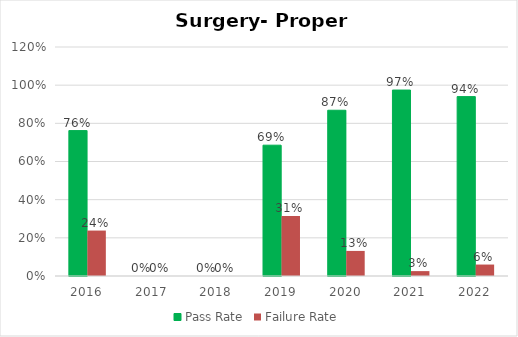
| Category | Pass Rate | Failure Rate |
|---|---|---|
| 2016.0 | 0.762 | 0.238 |
| 2017.0 | 0 | 0 |
| 2018.0 | 0 | 0 |
| 2019.0 | 0.686 | 0.314 |
| 2020.0 | 0.869 | 0.131 |
| 2021.0 | 0.974 | 0.026 |
| 2022.0 | 0.94 | 0.06 |